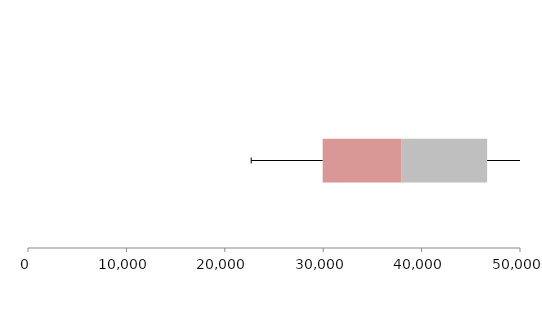
| Category | Series 1 | Series 2 | Series 3 |
|---|---|---|---|
| 0 | 29947.071 | 8022.217 | 8690.693 |